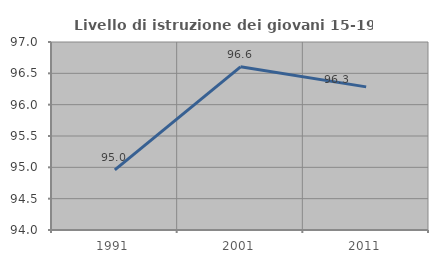
| Category | Livello di istruzione dei giovani 15-19 anni |
|---|---|
| 1991.0 | 94.96 |
| 2001.0 | 96.604 |
| 2011.0 | 96.284 |